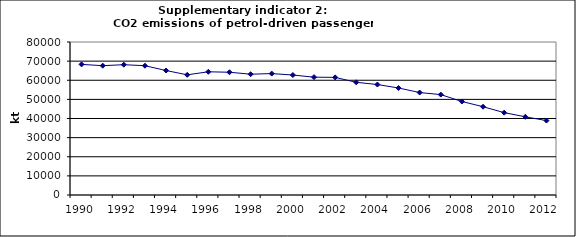
| Category | CO2 emissions of petrol-driven passenger cars, kt |
|---|---|
| 1990 | 68298.078 |
| 1991 | 67622.517 |
| 1992 | 68135.081 |
| 1993 | 67598.619 |
| 1994 | 65088.554 |
| 1995 | 62842.581 |
| 1996 | 64425.209 |
| 1997 | 64188.542 |
| 1998 | 63160.532 |
| 1999 | 63484.565 |
| 2000 | 62727.804 |
| 2001 | 61610.442 |
| 2002 | 61500.401 |
| 2003 | 58923.555 |
| 2004 | 57767.557 |
| 2005 | 55947.975 |
| 2006 | 53570.693 |
| 2007 | 52494.359 |
| 2008 | 48895.458 |
| 2009 | 46163.081 |
| 2010 | 43066.642 |
| 2011 | 40886.121 |
| 2012 | 38915.042 |